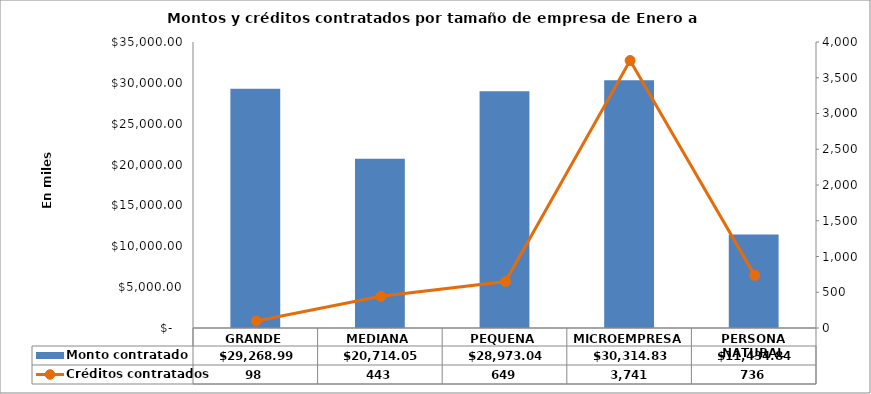
| Category | Monto contratado |
|---|---|
| GRANDE | 29268.994 |
| MEDIANA | 20714.048 |
| PEQUENA | 28973.038 |
| MICROEMPRESA | 30314.829 |
| PERSONA NATURAL | 11434.836 |